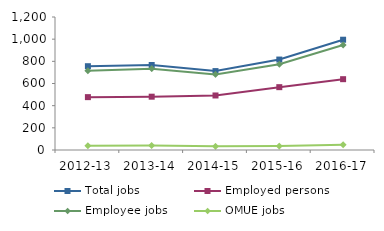
| Category | Total jobs | Employed persons | Employee jobs | OMUE jobs |
|---|---|---|---|---|
| 2012-13 | 756 | 477 | 715 | 39 |
| 2013-14 | 767 | 481 | 734 | 41 |
| 2014-15 | 712 | 492 | 682 | 33 |
| 2015-16 | 816 | 567 | 774 | 35 |
| 2016-17 | 995 | 639 | 948 | 47 |